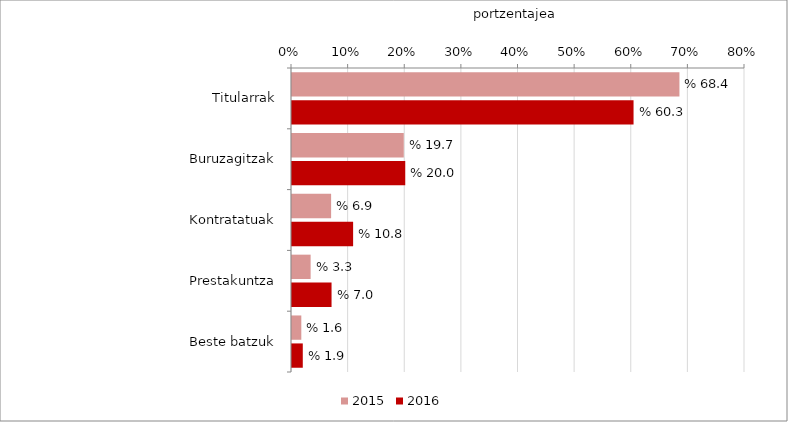
| Category | 2015 | 2016 |
|---|---|---|
| Titularrak | 0.684 | 0.603 |
| Buruzagitzak | 0.197 | 0.2 |
| Kontratatuak | 0.069 | 0.108 |
| Prestakuntza | 0.033 | 0.07 |
| Beste batzuk | 0.016 | 0.019 |